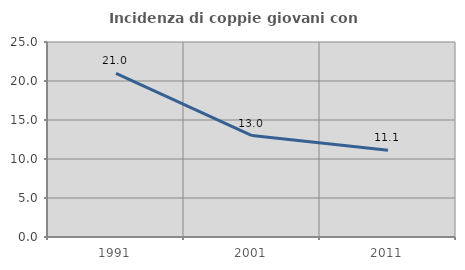
| Category | Incidenza di coppie giovani con figli |
|---|---|
| 1991.0 | 20.974 |
| 2001.0 | 13.002 |
| 2011.0 | 11.13 |